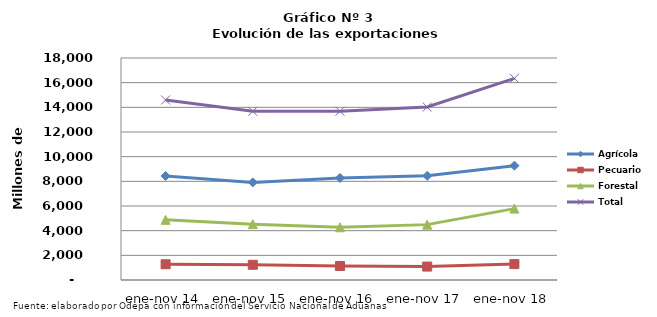
| Category | Agrícola | Pecuario | Forestal | Total |
|---|---|---|---|---|
| ene-nov 14 | 8435448 | 1278119 | 4881145 | 14594712 |
| ene-nov 15 | 7914034 | 1233633 | 4528541 | 13676208 |
| ene-nov 16 | 8272582 | 1135833 | 4274966 | 13683381 |
| ene-nov 17 | 8446147 | 1088304 | 4489789 | 14024240 |
| ene-nov 18 | 9271934 | 1290269 | 5787680 | 16349883 |